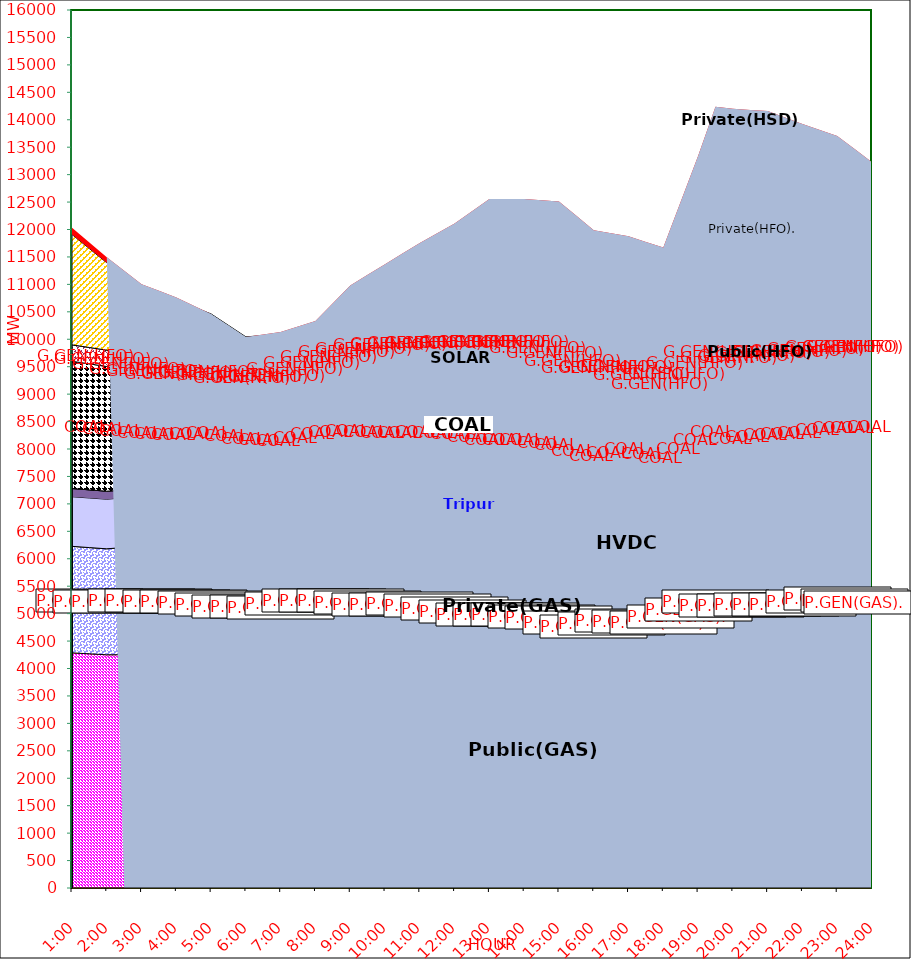
| Category | GAS | P.GEN(GAS). |  HVDC | TRIPURA | HYDRO | COAL | SOLAR | G.GEN(HFO) | P.GEN(HFO). | G.GEN(HSD) | P.GEN(HSD) | SHORTAGE | Total Energy Gen 288.363 MKWHr 
Energy Not Served   2.827 MKWHr 
Energy Requirement     291.190 MKWHr  |
|---|---|---|---|---|---|---|---|---|---|---|---|---|---|
| 1:00 | 4285 | 1941 | 904 | 150 | 0 | 2319 | 0 | 299 | 2012 | 0 | 0 | 120.33 |  |
| 1:30 | 4267.5 | 1936 | 904 | 148 | 0 | 2295.5 | 0 | 298.5 | 1802.5 | 0 | 0 | 110.302 |  |
| 2:00 | 4250 | 1931 | 904 | 146 | 0 | 2272 | 0 | 298 | 1593 | 0 | 0 | 100.275 |  |
| 2:30 | 4251.5 | 1954.5 | 905 | 144 | 0 | 2160 | 0 | 285.5 | 1461 | 0 | 0 | 87.86 |  |
| 3:00 | 4253 | 1978 | 906 | 142 | 0 | 2048 | 0 | 273 | 1329 | 0 | 0 | 75.445 |  |
| 3:30 | 4250.5 | 1970 | 906.5 | 140 | 0 | 2037.5 | 0 | 237 | 1279 | 0 | 0 | 62.552 |  |
| 4:00 | 4248 | 1962 | 907 | 138 | 0 | 2027 | 0 | 201 | 1229 | 0 | 0 | 49.66 |  |
| 4:30 | 4231.5 | 1963.5 | 906.5 | 136 | 0 | 2094 | 0 | 140.5 | 1114.5 | 0 | 0 | 24.83 |  |
| 5:00 | 4215 | 1965 | 906 | 134 | 0 | 2161 | 0 | 80 | 1000 | 0 | 0 | 0 |  |
| 5:30 | 4188.5 | 1948.5 | 906.5 | 129 | 0 | 2146.5 | 8.5 | 64 | 860.5 | 0 | 0 | 0 |  |
| 6:00 | 4162 | 1932 | 907 | 124 | 0 | 2132 | 17 | 48 | 721 | 0 | 0 | 0 |  |
| 6:30 | 4160 | 1926 | 907 | 123 | 0 | 2111.5 | 56 | 64 | 719.5 | 0 | 0 | 20.055 |  |
| 7:00 | 4158 | 1920 | 907 | 122 | 0 | 2091 | 95 | 80 | 718 | 0 | 0 | 40.11 |  |
| 7:30 | 4228 | 1908.5 | 909 | 126 | 0 | 2091.5 | 156 | 80 | 692.5 | 0 | 0 | 40.11 |  |
| 8:00 | 4298 | 1897 | 911 | 130 | 0 | 2092 | 217 | 80 | 667 | 0 | 0 | 40.11 |  |
| 8:30 | 4291.5 | 1894 | 911 | 138 | 0 | 2153 | 252.5 | 81 | 844 | 0 | 0 | 91.202 |  |
| 9:00 | 4285 | 1891 | 911 | 146 | 0 | 2214 | 288 | 82 | 1021 | 0 | 0 | 142.295 |  |
| 9:30 | 4251 | 1886.5 | 911 | 151 | 0 | 2234.5 | 337.5 | 133.5 | 1132.5 | 0 | 0 | 137.042 |  |
| 10:00 | 4217 | 1882 | 911 | 156 | 0 | 2255 | 387 | 185 | 1244 | 0 | 0 | 131.79 |  |
| 10:30 | 4233.5 | 1879 | 911 | 158 | 12.5 | 2226 | 399.5 | 202 | 1443.5 | 10 | 0 | 86.905 |  |
| 11:00 | 4250 | 1876 | 911 | 160 | 25 | 2197 | 412 | 219 | 1643 | 20 | 0 | 42.02 |  |
| 11:30 | 4199 | 1885 | 911 | 160 | 25 | 2235.5 | 419.5 | 219 | 1806 | 20 | 0 | 52.047 |  |
| 12:00 | 4148 | 1894 | 911 | 160 | 25 | 2274 | 427 | 219 | 1969 | 20 | 0 | 62.075 |  |
| 12:30 | 4108.5 | 1863 | 911.5 | 167 | 25 | 2294.5 | 438.5 | 287.5 | 2079 | 20 | 0 | 137.52 |  |
| 13:00 | 4069 | 1832 | 912 | 174 | 25 | 2315 | 450 | 356 | 2189 | 20 | 0 | 212.965 |  |
| 13:30 | 4069 | 1832 | 912 | 174 | 25 | 2315 | 450 | 356 | 2189 | 20 | 0 | 212.965 |  |
| 14:00 | 4069 | 1832 | 912 | 174 | 25 | 2315 | 450 | 356 | 2189 | 20 | 0 | 212.965 |  |
| 14:30 | 4046.5 | 1816 | 911.5 | 168 | 25 | 2314.5 | 378.5 | 390 | 2307 | 10 | 0 | 165.215 |  |
| 15:00 | 4024 | 1800 | 911 | 162 | 25 | 2314 | 307 | 424 | 2425 | 0 | 0 | 117.465 |  |
| 15:30 | 3974.5 | 1744.5 | 909.5 | 161 | 25 | 2327 | 257 | 441.5 | 2282 | 0 | 0 | 126.537 |  |
| 16:00 | 3925 | 1689 | 908 | 160 | 25 | 2340 | 207 | 459 | 2139 | 0 | 0 | 135.61 |  |
| 16:30 | 3952.5 | 1740 | 906.5 | 149 | 25 | 2335 | 156 | 467 | 2055.5 | 0 | 0 | 145.16 |  |
| 17:00 | 3980 | 1791 | 905 | 138 | 25 | 2330 | 105 | 475 | 1972 | 0 | 0 | 154.71 |  |
| 17:30 | 3981 | 1757.5 | 905.5 | 139 | 25 | 2226.5 | 61 | 509.5 | 2050.5 | 0 | 0 | 117.355 |  |
| 18:00 | 3982 | 1724 | 906 | 140 | 25 | 2123 | 17 | 544 | 2129 | 0 | 0 | 80 |  |
| 18:30 | 4062 | 1786.5 | 906 | 152 | 25 | 2157.5 | 8.5 | 564 | 2717 | 0 | 0 | 125.5 |  |
| 19:00 | 4142 | 1849 | 906 | 164 | 25 | 2192 | 0 | 584 | 3305 | 0 | 0 | 171 |  |
| 19:30 | 4294 | 1864 | 810 | 158 | 25 | 2320 | 0 | 620 | 3705 | 0 | 280 | 160 |  |
| 20:00 | 4222 | 1851 | 801 | 152 | 25 | 2287 | 0 | 656 | 3816 | 0 | 240 | 149 |  |
| 20:30 | 4220 | 1873 | 801.5 | 152 | 25 | 2307 | 0 | 664.5 | 3820.5 | 0 | 210 | 106 |  |
| 21:00 | 4218 | 1895 | 802 | 152 | 25 | 2327 | 0 | 673 | 3825 | 0 | 180 | 63 |  |
| 21:30 | 4213.5 | 1899 | 821 | 153 | 25 | 2333 | 0 | 668 | 3757.5 | 0 | 90 | 80.205 |  |
| 22:00 | 4209 | 1903 | 840 | 154 | 25 | 2339 | 0 | 663 | 3690 | 0 | 0 | 97.41 |  |
| 22:30 | 4258 | 1914.5 | 840.5 | 156 | 12.5 | 2334 | 0 | 631.5 | 3442.5 | 0 | 0 | 222.037 |  |
| 23:00 | 4307 | 1926 | 841 | 158 | 0 | 2329 | 0 | 600 | 3195 | 0 | 0 | 346.665 |  |
| 23:30 | 4269.5 | 1928.5 | 874.5 | 162 | 0 | 2330 | 0 | 603.5 | 2856.5 | 0 | 0 | 440.255 |  |
| 24:00 | 4232 | 1931 | 908 | 166 | 0 | 2331 | 0 | 607 | 2518 | 0 | 0 | 533.845 |  |